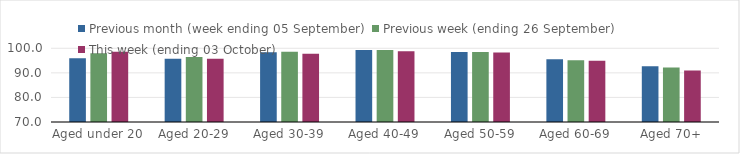
| Category | Previous month (week ending 05 September) | Previous week (ending 26 September) | This week (ending 03 October) |
|---|---|---|---|
| Aged under 20 | 95.99 | 97.96 | 98.57 |
| Aged 20-29 | 95.77 | 96.5 | 95.71 |
| Aged 30-39 | 98.34 | 98.55 | 97.73 |
| Aged 40-49 | 99.31 | 99.3 | 98.81 |
| Aged 50-59 | 98.52 | 98.48 | 98.25 |
| Aged 60-69 | 95.49 | 95.17 | 94.94 |
| Aged 70+ | 92.65 | 92.18 | 90.94 |